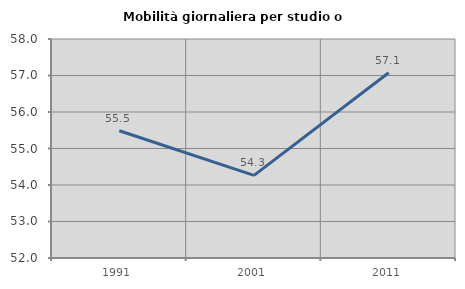
| Category | Mobilità giornaliera per studio o lavoro |
|---|---|
| 1991.0 | 55.487 |
| 2001.0 | 54.263 |
| 2011.0 | 57.077 |